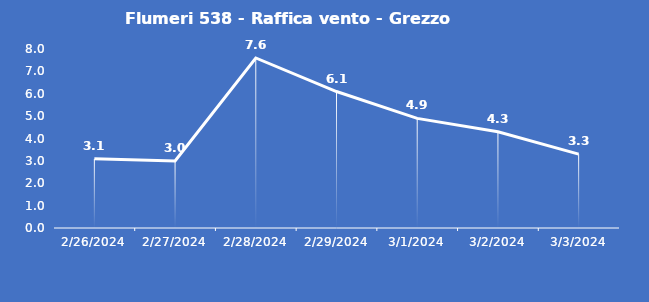
| Category | Flumeri 538 - Raffica vento - Grezzo (m/s) |
|---|---|
| 2/26/24 | 3.1 |
| 2/27/24 | 3 |
| 2/28/24 | 7.6 |
| 2/29/24 | 6.1 |
| 3/1/24 | 4.9 |
| 3/2/24 | 4.3 |
| 3/3/24 | 3.3 |